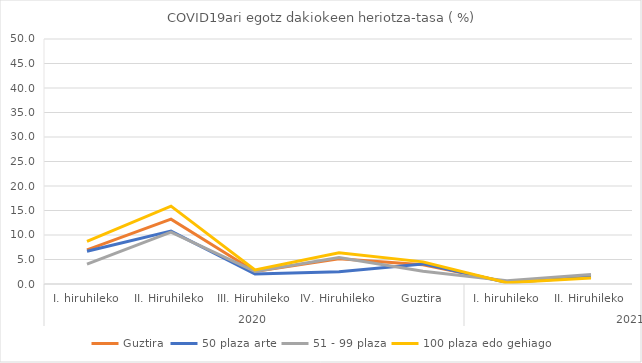
| Category | Guztira | 50 plaza arte | 51 - 99 plaza | 100 plaza edo gehiago |
|---|---|---|---|---|
| 0 | 6.979 | 6.7 | 4.04 | 8.702 |
| 1 | 13.228 | 10.804 | 10.57 | 15.889 |
| 2 | 2.57 | 2.019 | 2.57 | 2.854 |
| 3 | 5.144 | 2.484 | 5.425 | 6.355 |
| 4 | 3.914 | 4.103 | 2.606 | 4.518 |
| 5 | 0.385 | 0.312 | 0.685 | 0.262 |
| 6 | 1.463 | 1.445 | 1.939 | 1.214 |